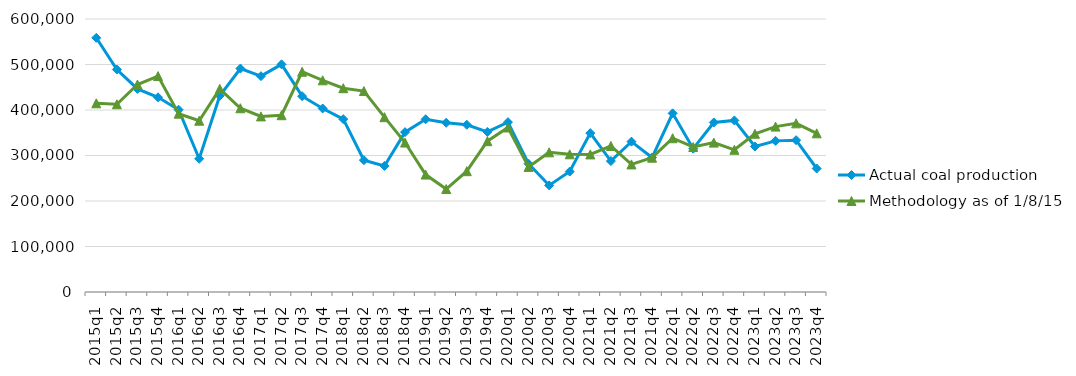
| Category | Actual coal production | Methodology as of 1/8/15 |
|---|---|---|
| 2015q1 | 558681 | 414749 |
| 2015q2 | 488998 | 412589 |
| 2015q3 | 446328 | 456005 |
| 2015q4 | 427862 | 474526 |
| 2016q1 | 400625 | 391954 |
| 2016q2 | 292821 | 376441 |
| 2016q3 | 431249 | 446547 |
| 2016q4 | 491051 | 403865 |
| 2017q1 | 474364 | 385930 |
| 2017q2 | 500312 | 388535 |
| 2017q3 | 430354 | 484090 |
| 2017q4 | 403354 | 465278 |
| 2018q1 | 379844 | 447905 |
| 2018q2 | 289802 | 441692 |
| 2018q3 | 277075 | 384232 |
| 2018q4 | 351387 | 328462 |
| 2019q1 | 379691 | 258085 |
| 2019q2 | 371931 | 226339 |
| 2019q3 | 367567 | 265539 |
| 2019q4 | 351842 | 331463 |
| 2020q1 | 373251 | 361606 |
| 2020q2 | 281859 | 274868 |
| 2020q3 | 234334 | 306966 |
| 2020q4 | 264712 | 302638 |
| 2021q1 | 349222 | 302369 |
| 2021q2 | 287760 | 320949 |
| 2021q3 | 330494 | 280389 |
| 2021q4 | 295512 | 295209 |
| 2022q1 | 392650 | 337963 |
| 2022q2 | 314981 | 318721 |
| 2022q3 | 372598 | 328321 |
| 2022q4 | 377072 | 312543 |
| 2023q1 | 319829 | 347791 |
| 2023q2 | 332153 | 363497 |
| 2023q3 | 333717 | 370701 |
| 2023q4 | 271418 | 348724 |